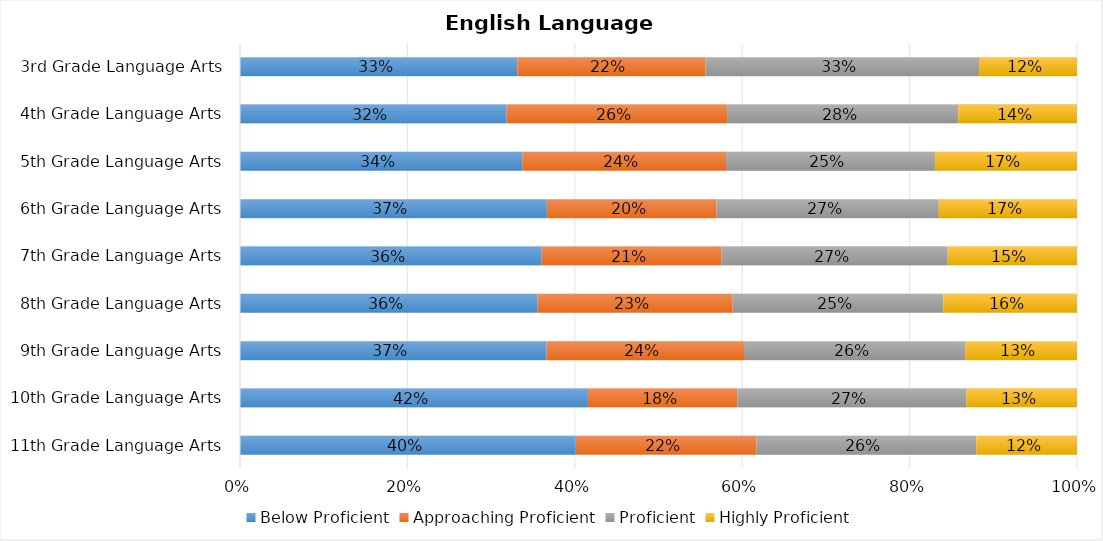
| Category | Below Proficient | Approaching Proficient | Proficient | Highly Proficient |
|---|---|---|---|---|
| 11th Grade Language Arts | 0.401 | 0.216 | 0.263 | 0.12 |
| 10th Grade Language Arts | 0.416 | 0.178 | 0.274 | 0.132 |
| 9th Grade Language Arts | 0.366 | 0.236 | 0.264 | 0.134 |
| 8th Grade Language Arts | 0.356 | 0.233 | 0.252 | 0.16 |
| 7th Grade Language Arts | 0.36 | 0.215 | 0.27 | 0.155 |
| 6th Grade Language Arts | 0.367 | 0.203 | 0.266 | 0.165 |
| 5th Grade Language Arts | 0.337 | 0.244 | 0.25 | 0.17 |
| 4th Grade Language Arts | 0.319 | 0.263 | 0.276 | 0.142 |
| 3rd Grade Language Arts | 0.331 | 0.225 | 0.327 | 0.117 |